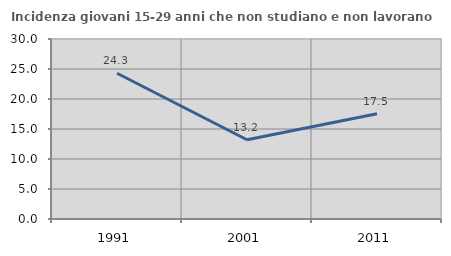
| Category | Incidenza giovani 15-29 anni che non studiano e non lavorano  |
|---|---|
| 1991.0 | 24.286 |
| 2001.0 | 13.208 |
| 2011.0 | 17.544 |